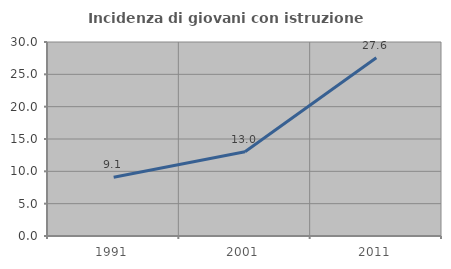
| Category | Incidenza di giovani con istruzione universitaria |
|---|---|
| 1991.0 | 9.071 |
| 2001.0 | 13.031 |
| 2011.0 | 27.576 |